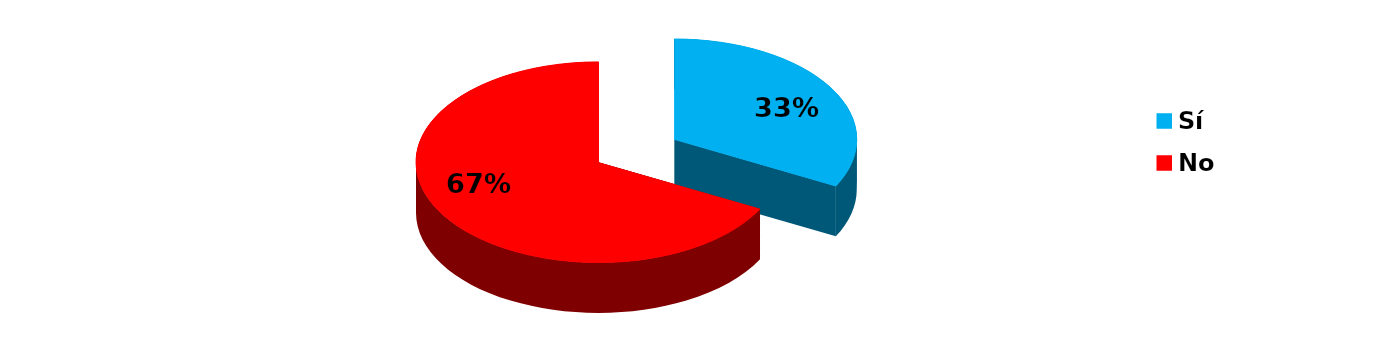
| Category | Series 0 |
|---|---|
| Sí | 34 |
| No | 70 |